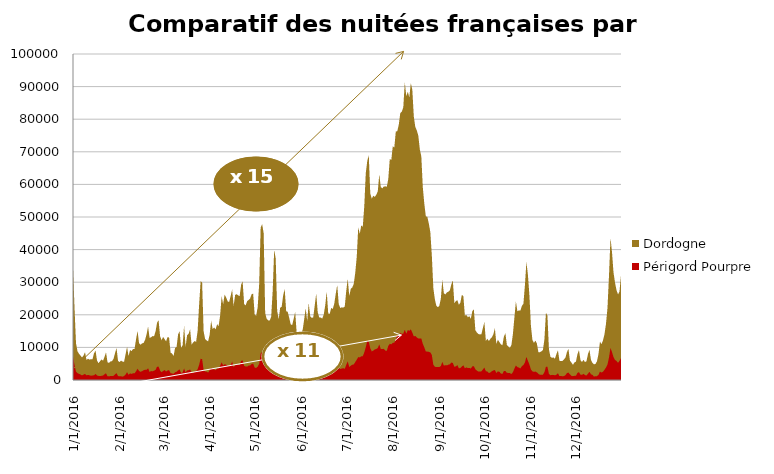
| Category | Dordogne | Périgord Pourpre |
|---|---|---|
| 1/1/16 | 34512 | 7158 |
| 1/2/16 | 22255 | 4649 |
| 1/3/16 | 11277 | 2537 |
| 1/4/16 | 8799 | 2102 |
| 1/5/16 | 8051 | 1889 |
| 1/6/16 | 7498 | 1685 |
| 1/7/16 | 6911 | 1405 |
| 1/8/16 | 7522 | 1640 |
| 1/9/16 | 8520 | 1884 |
| 1/10/16 | 6151 | 1428 |
| 1/11/16 | 6542 | 1564 |
| 1/12/16 | 6247 | 1444 |
| 1/13/16 | 6387 | 1313 |
| 1/14/16 | 6393 | 1394 |
| 1/15/16 | 8182 | 1453 |
| 1/16/16 | 9064 | 1887 |
| 1/17/16 | 5972 | 1384 |
| 1/18/16 | 5177 | 1260 |
| 1/19/16 | 5752 | 1213 |
| 1/20/16 | 6316 | 1273 |
| 1/21/16 | 5915 | 1386 |
| 1/22/16 | 7115 | 1746 |
| 1/23/16 | 8469 | 2086 |
| 1/24/16 | 5428 | 1160 |
| 1/25/16 | 5247 | 1126 |
| 1/26/16 | 5704 | 1232 |
| 1/27/16 | 5794 | 1211 |
| 1/28/16 | 6482 | 1275 |
| 1/29/16 | 8270 | 1751 |
| 1/30/16 | 9805 | 2103 |
| 1/31/16 | 5853 | 1197 |
| 2/1/16 | 5503 | 1167 |
| 2/2/16 | 5955 | 1160 |
| 2/3/16 | 5650 | 1019 |
| 2/4/16 | 5575 | 1248 |
| 2/5/16 | 7820 | 1663 |
| 2/6/16 | 10170 | 2411 |
| 2/7/16 | 7362 | 1607 |
| 2/8/16 | 9221 | 2017 |
| 2/9/16 | 8850 | 1862 |
| 2/10/16 | 9540 | 2079 |
| 2/11/16 | 9531 | 2050 |
| 2/12/16 | 12506 | 2676 |
| 2/13/16 | 15045 | 3490 |
| 2/14/16 | 11297 | 2747 |
| 2/15/16 | 10824 | 2503 |
| 2/16/16 | 11252 | 2704 |
| 2/17/16 | 11343 | 3001 |
| 2/18/16 | 12296 | 3125 |
| 2/19/16 | 14005 | 3127 |
| 2/20/16 | 16393 | 3623 |
| 2/21/16 | 12971 | 2466 |
| 2/22/16 | 13078 | 2742 |
| 2/23/16 | 13496 | 2684 |
| 2/24/16 | 13411 | 2858 |
| 2/25/16 | 14942 | 3113 |
| 2/26/16 | 17591 | 4090 |
| 2/27/16 | 18346 | 4106 |
| 2/28/16 | 13455 | 2898 |
| 2/29/16 | 12183 | 2391 |
| 3/1/16 | 13238 | 2765 |
| 3/2/16 | 12523 | 3048 |
| 3/3/16 | 11857 | 2580 |
| 3/4/16 | 13171 | 2941 |
| 3/5/16 | 13043 | 2982 |
| 3/6/16 | 8400 | 2097 |
| 3/7/16 | 8104 | 2009 |
| 3/8/16 | 7382 | 1877 |
| 3/9/16 | 9859 | 2366 |
| 3/10/16 | 10143 | 2539 |
| 3/11/16 | 14006 | 2941 |
| 3/12/16 | 14971 | 3278 |
| 3/13/16 | 9864 | 2122 |
| 3/14/16 | 10634 | 2316 |
| 3/15/16 | 16591 | 3550 |
| 3/16/16 | 10229 | 2280 |
| 3/17/16 | 13735 | 2933 |
| 3/18/16 | 14169 | 3006 |
| 3/19/16 | 15538 | 3217 |
| 3/20/16 | 10873 | 2348 |
| 3/21/16 | 11503 | 2198 |
| 3/22/16 | 11961 | 2587 |
| 3/23/16 | 11734 | 2716 |
| 3/24/16 | 15000 | 3310 |
| 3/25/16 | 23021 | 4618 |
| 3/26/16 | 30271 | 6513 |
| 3/27/16 | 29951 | 6396 |
| 3/28/16 | 14938 | 3078 |
| 3/29/16 | 12611 | 2623 |
| 3/30/16 | 12148 | 2558 |
| 3/31/16 | 11844 | 2285 |
| 4/1/16 | 13858 | 3000 |
| 4/2/16 | 18157 | 3741 |
| 4/3/16 | 15669 | 3361 |
| 4/4/16 | 16087 | 3293 |
| 4/5/16 | 15573 | 2983 |
| 4/6/16 | 17103 | 3579 |
| 4/7/16 | 16553 | 3498 |
| 4/8/16 | 19782 | 4349 |
| 4/9/16 | 25667 | 5427 |
| 4/10/16 | 23321 | 4497 |
| 4/11/16 | 26179 | 4823 |
| 4/12/16 | 25322 | 4694 |
| 4/13/16 | 24147 | 4343 |
| 4/14/16 | 23913 | 4337 |
| 4/15/16 | 25785 | 4596 |
| 4/16/16 | 27760 | 5655 |
| 4/17/16 | 22756 | 3942 |
| 4/18/16 | 26088 | 4566 |
| 4/19/16 | 26315 | 4716 |
| 4/20/16 | 25982 | 4687 |
| 4/21/16 | 25758 | 4587 |
| 4/22/16 | 29277 | 5896 |
| 4/23/16 | 30200 | 5973 |
| 4/24/16 | 23253 | 4317 |
| 4/25/16 | 22895 | 4127.5 |
| 4/26/16 | 24168 | 4104 |
| 4/27/16 | 24570.5 | 4419 |
| 4/28/16 | 25037.5 | 4450 |
| 4/29/16 | 26323 | 4934 |
| 4/30/16 | 26477.5 | 5037 |
| 5/1/16 | 20080 | 3814 |
| 5/2/16 | 19702 | 3689 |
| 5/3/16 | 22303 | 4104 |
| 5/4/16 | 29399 | 4946 |
| 5/5/16 | 46795 | 8166 |
| 5/6/16 | 47796 | 8543 |
| 5/7/16 | 44995 | 8320 |
| 5/8/16 | 20552 | 3852 |
| 5/9/16 | 18777 | 3926 |
| 5/10/16 | 18281 | 3430 |
| 5/11/16 | 18218 | 3528 |
| 5/12/16 | 19408 | 3864 |
| 5/13/16 | 27259 | 5266 |
| 5/14/16 | 39902 | 6839 |
| 5/15/16 | 37359 | 6974 |
| 5/16/16 | 21191 | 4230 |
| 5/17/16 | 18685 | 3450 |
| 5/18/16 | 22192 | 3719 |
| 5/19/16 | 22480 | 3625 |
| 5/20/16 | 26019 | 4168 |
| 5/21/16 | 27907 | 4721 |
| 5/22/16 | 21068 | 3540 |
| 5/23/16 | 20931 | 3961 |
| 5/24/16 | 19089 | 3470 |
| 5/25/16 | 17065 | 3020 |
| 5/26/16 | 16846 | 2737 |
| 5/27/16 | 18840 | 3410 |
| 5/28/16 | 20887 | 3792 |
| 5/29/16 | 14262 | 2627 |
| 5/30/16 | 13782 | 2497 |
| 5/31/16 | 13987 | 2461 |
| 6/1/16 | 14314 | 2829 |
| 6/2/16 | 15450 | 2856 |
| 6/3/16 | 18694 | 3644 |
| 6/4/16 | 21978 | 4279 |
| 6/5/16 | 18059 | 3601 |
| 6/6/16 | 23598 | 4482 |
| 6/7/16 | 19554 | 3637 |
| 6/8/16 | 19043 | 3189 |
| 6/9/16 | 19210 | 3384 |
| 6/10/16 | 22838 | 3793 |
| 6/11/16 | 26565 | 4593 |
| 6/12/16 | 20820 | 3308 |
| 6/13/16 | 19199 | 3218 |
| 6/14/16 | 19142 | 3191 |
| 6/15/16 | 18840 | 3184 |
| 6/16/16 | 20047 | 3360 |
| 6/17/16 | 22916 | 3836 |
| 6/18/16 | 27128 | 4720 |
| 6/19/16 | 20388 | 2991 |
| 6/20/16 | 20297 | 3082 |
| 6/21/16 | 22130 | 3049 |
| 6/22/16 | 21773 | 3178 |
| 6/23/16 | 23368 | 3544 |
| 6/24/16 | 26432 | 4243 |
| 6/25/16 | 29148 | 5120 |
| 6/26/16 | 23285 | 3749 |
| 6/27/16 | 22101 | 3367 |
| 6/28/16 | 22286 | 3511 |
| 6/29/16 | 22212 | 3639 |
| 6/30/16 | 22508 | 3436 |
| 7/1/16 | 27315 | 4649 |
| 7/2/16 | 31035 | 5734 |
| 7/3/16 | 25760 | 3971 |
| 7/4/16 | 27932 | 4380 |
| 7/5/16 | 28371 | 4695 |
| 7/6/16 | 29492 | 4763 |
| 7/7/16 | 32880 | 5516 |
| 7/8/16 | 37835 | 6251 |
| 7/9/16 | 46898 | 7042 |
| 7/10/16 | 44828 | 6913 |
| 7/11/16 | 47463 | 7273 |
| 7/12/16 | 46965 | 7323 |
| 7/13/16 | 53232 | 8437 |
| 7/14/16 | 63435 | 10042 |
| 7/15/16 | 67180 | 12110 |
| 7/16/16 | 69033 | 11700 |
| 7/17/16 | 57218 | 9744 |
| 7/18/16 | 55632 | 8754 |
| 7/19/16 | 56534 | 9011 |
| 7/20/16 | 56152 | 9386 |
| 7/21/16 | 56815 | 9520 |
| 7/22/16 | 57849 | 9817 |
| 7/23/16 | 63072 | 10932 |
| 7/24/16 | 59180 | 9479 |
| 7/25/16 | 58792 | 9515 |
| 7/26/16 | 59318 | 9569 |
| 7/27/16 | 59413 | 9026 |
| 7/28/16 | 59245 | 8965 |
| 7/29/16 | 61692 | 10473 |
| 7/30/16 | 67827 | 11094 |
| 7/31/16 | 67484 | 10962 |
| 8/1/16 | 71730 | 11386 |
| 8/2/16 | 71261 | 11462 |
| 8/3/16 | 76218 | 12473 |
| 8/4/16 | 76317 | 13700 |
| 8/5/16 | 78352 | 13735 |
| 8/6/16 | 81911 | 14432 |
| 8/7/16 | 82297 | 14165 |
| 8/8/16 | 83644 | 14230 |
| 8/9/16 | 91377 | 15425 |
| 8/10/16 | 87042 | 14205 |
| 8/11/16 | 88458 | 15353 |
| 8/12/16 | 86694 | 15062 |
| 8/13/16 | 91080 | 15534 |
| 8/14/16 | 89125 | 14551 |
| 8/15/16 | 80856 | 13380 |
| 8/16/16 | 77629 | 13491 |
| 8/17/16 | 76535 | 13023 |
| 8/18/16 | 74985 | 12758 |
| 8/19/16 | 70744 | 12742 |
| 8/20/16 | 68601 | 12754 |
| 8/21/16 | 59097 | 11074 |
| 8/22/16 | 54057 | 10024 |
| 8/23/16 | 50202 | 8722 |
| 8/24/16 | 50075 | 8716 |
| 8/25/16 | 47981 | 8635 |
| 8/26/16 | 45381 | 8466 |
| 8/27/16 | 38260 | 7691 |
| 8/28/16 | 28229 | 4698 |
| 8/29/16 | 24812 | 4069 |
| 8/30/16 | 22775 | 3953 |
| 8/31/16 | 22340 | 3991 |
| 9/1/16 | 22787 | 3968 |
| 9/2/16 | 24951 | 4295 |
| 9/3/16 | 30775 | 5554 |
| 9/4/16 | 26626 | 4419 |
| 9/5/16 | 26245 | 4515 |
| 9/6/16 | 26851 | 4486 |
| 9/7/16 | 27077 | 4694 |
| 9/8/16 | 27519 | 4827 |
| 9/9/16 | 29319 | 5367 |
| 9/10/16 | 30547 | 5228 |
| 9/11/16 | 23590 | 4074 |
| 9/12/16 | 24204 | 4173 |
| 9/13/16 | 24480 | 4583 |
| 9/14/16 | 23069 | 3620 |
| 9/15/16 | 23736 | 3656 |
| 9/16/16 | 26104 | 4133 |
| 9/17/16 | 25741 | 4506 |
| 9/18/16 | 19807 | 3598 |
| 9/19/16 | 19934 | 3870 |
| 9/20/16 | 19280 | 3656 |
| 9/21/16 | 19572 | 3702 |
| 9/22/16 | 18796 | 3532 |
| 9/23/16 | 21156 | 4191 |
| 9/24/16 | 21643 | 4234 |
| 9/25/16 | 15284 | 3280 |
| 9/26/16 | 14563 | 2899 |
| 9/27/16 | 14110 | 2570 |
| 9/28/16 | 13986 | 2591 |
| 9/29/16 | 14020 | 2655 |
| 9/30/16 | 15944 | 3229 |
| 10/1/16 | 17767 | 3807 |
| 10/2/16 | 12026 | 2709 |
| 10/3/16 | 12651 | 2607 |
| 10/4/16 | 11964 | 2129 |
| 10/5/16 | 12640 | 2326 |
| 10/6/16 | 13079 | 2708 |
| 10/7/16 | 14050 | 2933 |
| 10/8/16 | 15851 | 3053 |
| 10/9/16 | 11111 | 2136 |
| 10/10/16 | 12348 | 2660 |
| 10/11/16 | 11632 | 2520 |
| 10/12/16 | 10946 | 1980 |
| 10/13/16 | 10660 | 1862 |
| 10/14/16 | 13315 | 2778 |
| 10/15/16 | 14383 | 2742 |
| 10/16/16 | 10710 | 2214 |
| 10/17/16 | 10238 | 2158 |
| 10/18/16 | 9880 | 2113 |
| 10/19/16 | 10713 | 1830 |
| 10/20/16 | 14083 | 2378 |
| 10/21/16 | 19178 | 3507 |
| 10/22/16 | 24110 | 4445 |
| 10/23/16 | 21086 | 3950 |
| 10/24/16 | 21347 | 3820 |
| 10/25/16 | 21294 | 3543 |
| 10/26/16 | 22740 | 4268 |
| 10/27/16 | 23377 | 4572 |
| 10/28/16 | 29070 | 5385 |
| 10/29/16 | 36252 | 7097 |
| 10/30/16 | 32305 | 5881 |
| 10/31/16 | 25935 | 4731 |
| 11/1/16 | 16643 | 3260 |
| 11/2/16 | 12272 | 2630 |
| 11/3/16 | 11405 | 2503 |
| 11/4/16 | 12089 | 2586 |
| 11/5/16 | 11134 | 2325 |
| 11/6/16 | 8502 | 1885 |
| 11/7/16 | 8545 | 1592 |
| 11/8/16 | 8796 | 1627 |
| 11/9/16 | 9188 | 1616 |
| 11/10/16 | 12511 | 2426 |
| 11/11/16 | 20619 | 4054 |
| 11/12/16 | 19779 | 4052 |
| 11/13/16 | 9442 | 1852 |
| 11/14/16 | 7120 | 1471 |
| 11/15/16 | 6802 | 1575 |
| 11/16/16 | 6930 | 1558 |
| 11/17/16 | 6531 | 1422 |
| 11/18/16 | 7957 | 1629 |
| 11/19/16 | 9105 | 2081 |
| 11/20/16 | 5882 | 1180 |
| 11/21/16 | 5826 | 1268 |
| 11/22/16 | 5854 | 1134 |
| 11/23/16 | 6319 | 1213 |
| 11/24/16 | 6875 | 1475 |
| 11/25/16 | 8575 | 2134 |
| 11/26/16 | 9553 | 2280 |
| 11/27/16 | 5922 | 1718 |
| 11/28/16 | 5336 | 1252 |
| 11/29/16 | 4660 | 1177 |
| 11/30/16 | 5391 | 1289 |
| 12/1/16 | 5626 | 1312 |
| 12/2/16 | 7910 | 2174 |
| 12/3/16 | 9186 | 2421 |
| 12/4/16 | 6111 | 1639 |
| 12/5/16 | 5503 | 1570 |
| 12/6/16 | 6169 | 1906 |
| 12/7/16 | 5496 | 1501 |
| 12/8/16 | 5752 | 1368 |
| 12/9/16 | 7957 | 1947 |
| 12/10/16 | 9266 | 2498 |
| 12/11/16 | 6162 | 1746 |
| 12/12/16 | 5269 | 1564 |
| 12/13/16 | 4808 | 1058 |
| 12/14/16 | 4925 | 1173 |
| 12/15/16 | 5738 | 1178 |
| 12/16/16 | 7950 | 1586 |
| 12/17/16 | 11780 | 2598 |
| 12/18/16 | 10995 | 2274 |
| 12/19/16 | 12130 | 2535 |
| 12/20/16 | 14038 | 3124 |
| 12/21/16 | 17213 | 3816 |
| 12/22/16 | 22102 | 4771 |
| 12/23/16 | 31925 | 6871 |
| 12/24/16 | 43609 | 9849 |
| 12/25/16 | 39273 | 8585 |
| 12/26/16 | 33038 | 7029 |
| 12/27/16 | 29915 | 6144 |
| 12/28/16 | 27600 | 5852 |
| 12/29/16 | 26252 | 5262 |
| 12/30/16 | 27144 | 5886 |
| 12/31/16 | 32159 | 6711 |